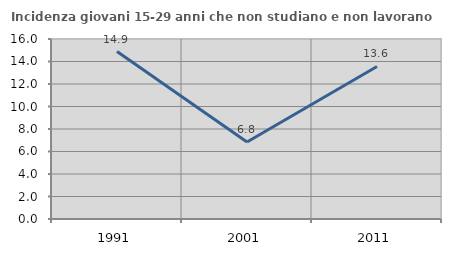
| Category | Incidenza giovani 15-29 anni che non studiano e non lavorano  |
|---|---|
| 1991.0 | 14.881 |
| 2001.0 | 6.849 |
| 2011.0 | 13.559 |